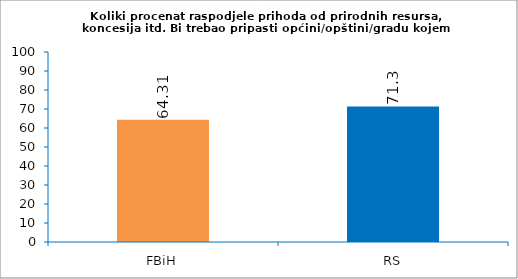
| Category | Koliki procenat raspodjele prihoda od prirodnih resursa, koncesija itd. Bi trebao pripasti općini/opštini/gradu kojem pripada prirodni resurs? |
|---|---|
| FBiH | 64.31 |
| RS | 71.3 |